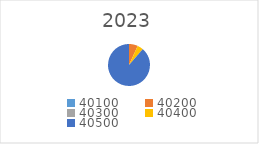
| Category | Series 0 |
|---|---|
| 40100.0 | 0 |
| 40200.0 | 30000 |
| 40300.0 | 0 |
| 40400.0 | 20000 |
| 40500.0 | 390000 |